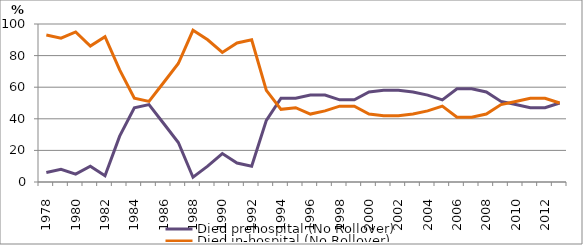
| Category | Died prehospital (No Rollover) | Died in-hospital (No Rollover) |
|---|---|---|
| 1978.0 | 6 | 93 |
| 1979.0 | 8 | 91 |
| 1980.0 | 5 | 95 |
| 1981.0 | 10 | 86 |
| 1982.0 | 4 | 92 |
| 1983.0 | 29 | 71 |
| 1984.0 | 47 | 53 |
| 1985.0 | 49 | 51 |
| 1986.0 | 37 | 63 |
| 1987.0 | 25 | 75 |
| 1988.0 | 3 | 96 |
| 1989.0 | 10 | 90 |
| 1990.0 | 18 | 82 |
| 1991.0 | 12 | 88 |
| 1992.0 | 10 | 90 |
| 1993.0 | 39 | 58 |
| 1994.0 | 53 | 46 |
| 1995.0 | 53 | 47 |
| 1996.0 | 55 | 43 |
| 1997.0 | 55 | 45 |
| 1998.0 | 52 | 48 |
| 1999.0 | 52 | 48 |
| 2000.0 | 57 | 43 |
| 2001.0 | 58 | 42 |
| 2002.0 | 58 | 42 |
| 2003.0 | 57 | 43 |
| 2004.0 | 55 | 45 |
| 2005.0 | 52 | 48 |
| 2006.0 | 59 | 41 |
| 2007.0 | 59 | 41 |
| 2008.0 | 57 | 43 |
| 2009.0 | 51 | 49 |
| 2010.0 | 49 | 51 |
| 2011.0 | 47 | 53 |
| 2012.0 | 47 | 53 |
| 2013.0 | 50 | 50 |